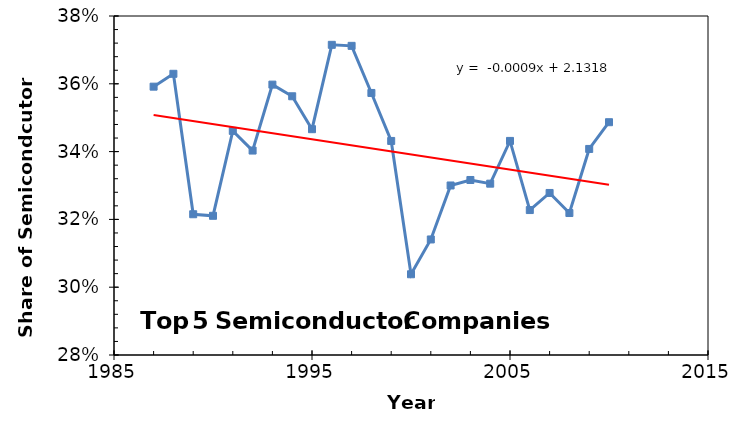
| Category | Series 0 |
|---|---|
| 1987.0 | 0.359 |
| 1988.0 | 0.363 |
| 1989.0 | 0.322 |
| 1990.0 | 0.321 |
| 1991.0 | 0.346 |
| 1992.0 | 0.34 |
| 1993.0 | 0.36 |
| 1994.0 | 0.356 |
| 1995.0 | 0.347 |
| 1996.0 | 0.371 |
| 1997.0 | 0.371 |
| 1998.0 | 0.357 |
| 1999.0 | 0.343 |
| 2000.0 | 0.304 |
| 2001.0 | 0.314 |
| 2002.0 | 0.33 |
| 2003.0 | 0.332 |
| 2004.0 | 0.331 |
| 2005.0 | 0.343 |
| 2006.0 | 0.323 |
| 2007.0 | 0.328 |
| 2008.0 | 0.322 |
| 2009.0 | 0.341 |
| 2010.0 | 0.349 |